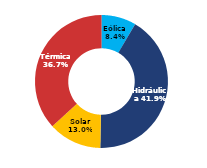
| Category | Sur |
|---|---|
| Eólica | 53.333 |
| Hidráulica | 264.394 |
| Solar | 81.927 |
| Térmica | 232.105 |